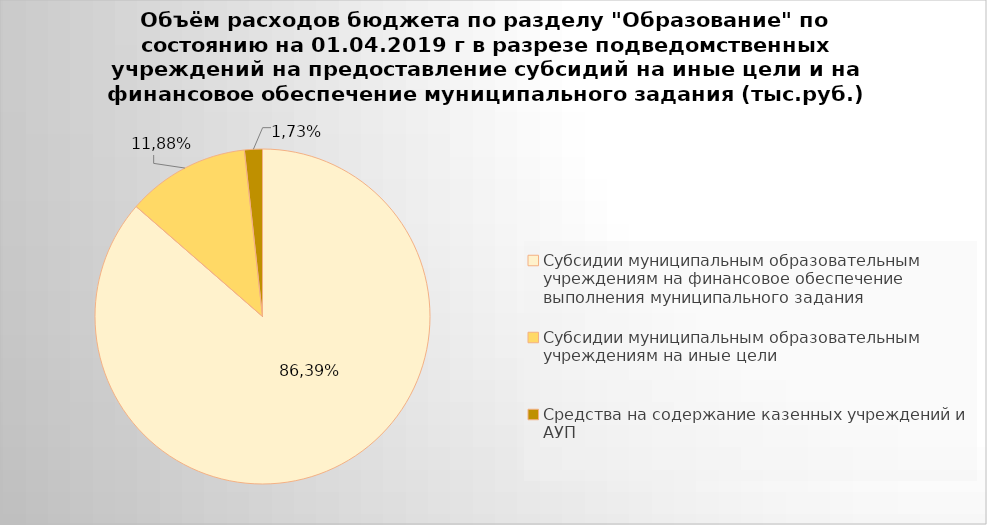
| Category | Series 0 |
|---|---|
| Субсидии муниципальным образовательным учреждениям на финансовое обеспечение выполнения муниципального задания | 4466295.58 |
| Субсидии муниципальным образовательным учреждениям на иные цели | 613940.16 |
| Средства на содержание казенных учреждений и АУП | 89369.9 |